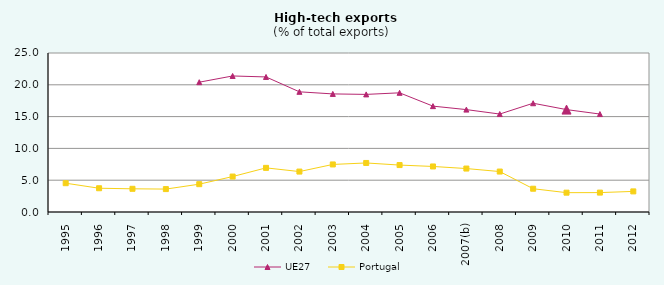
| Category | UE27  | Portugal |
|---|---|---|
| 1995 | 0 | 4.529 |
| 1996 | 0 | 3.735 |
| 1997 | 0 | 3.646 |
| 1998 | 0 | 3.602 |
| 1999 | 20.409 | 4.374 |
| 2000 | 21.39 | 5.573 |
| 2001 | 21.235 | 6.94 |
| 2002 | 18.895 | 6.356 |
| 2003 | 18.568 | 7.477 |
| 2004 | 18.492 | 7.71 |
| 2005 | 18.74 | 7.38 |
| 2006 | 16.645 | 7.16 |
| 2007(b) | 16.1 | 6.83 |
| 2008 | 15.4 | 6.36 |
| 2009 | 17.1 | 3.66 |
| 2010 | 16.1 | 3.04 |
| 2011 | 15.4 | 3.05 |
| 2012 | 0 | 3.24 |